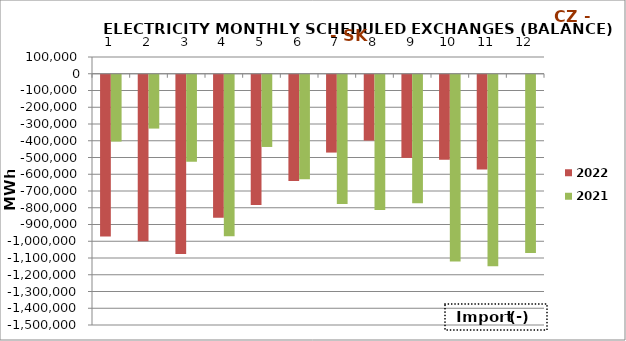
| Category | 2022 | 2021 |
|---|---|---|
| 0 | -966359 | -398975.6 |
| 1 | -993646.5 | -321378.5 |
| 2 | -1069792.1 | -519391.9 |
| 3 | -854149.8 | -964622.9 |
| 4 | -778070.6 | -431146 |
| 5 | -634260.3 | -623404.6 |
| 6 | -464594.5 | -772030.3 |
| 7 | -393179.6 | -808044.4 |
| 8 | -496463.8 | -766486.3 |
| 9 | -507720.8 | -1114676.8 |
| 10 | -565897.8 | -1143632.8 |
| 11 | 0 | -1063592.5 |